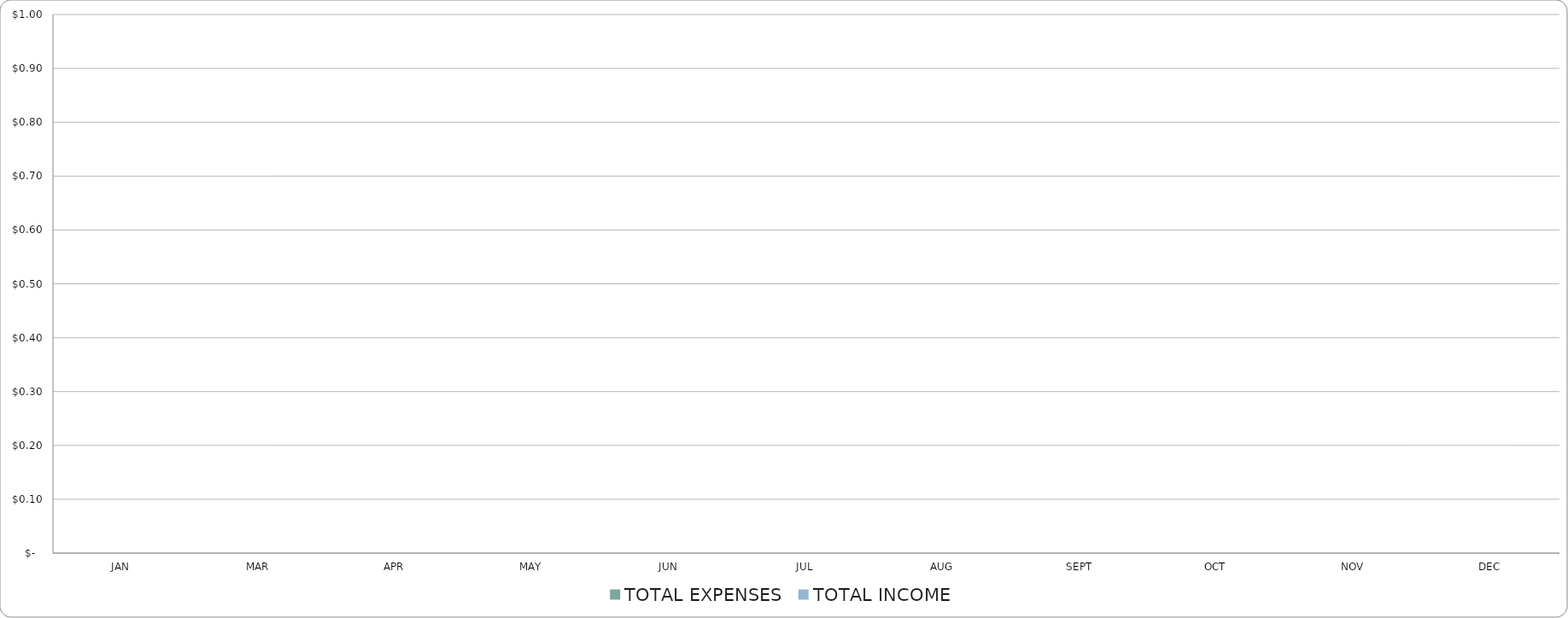
| Category | TOTAL EXPENSES | TOTAL INCOME |
|---|---|---|
| JAN | 0 | 0 |
| MAR | 0 | 0 |
| APR | 0 | 0 |
| MAY | 0 | 0 |
| JUN | 0 | 0 |
| JUL | 0 | 0 |
| AUG | 0 | 0 |
| SEPT | 0 | 0 |
| OCT | 0 | 0 |
| NOV | 0 | 0 |
| DEC | 0 | 0 |